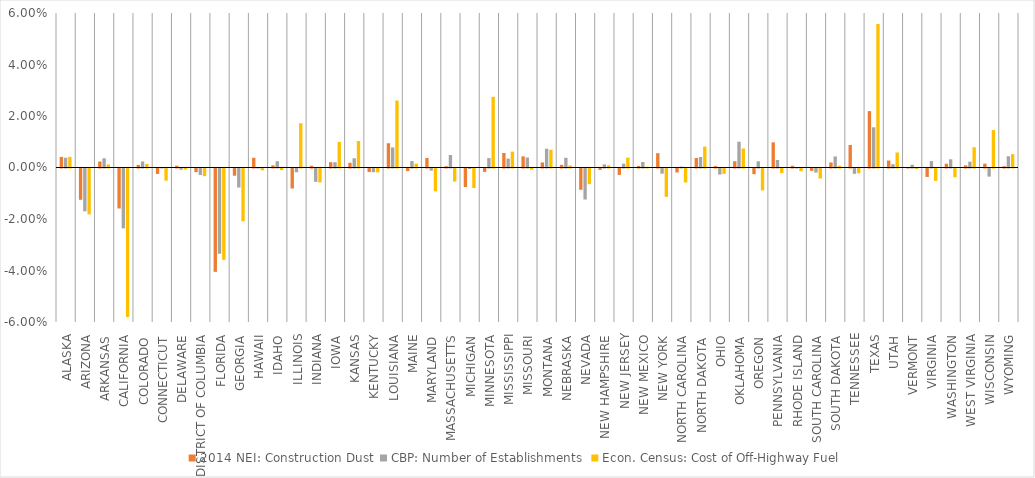
| Category | 2014 NEI: Construction Dust | CBP: Number of Establishments | Econ. Census: Cost of Off-Highway Fuel |
|---|---|---|---|
| ALASKA | 0.004 | 0.004 | 0.004 |
| ARIZONA | -0.012 | -0.017 | -0.018 |
| ARKANSAS | 0.002 | 0.004 | 0.001 |
| CALIFORNIA | -0.016 | -0.023 | -0.058 |
| COLORADO | 0.001 | 0.002 | 0.001 |
| CONNECTICUT | -0.002 | 0 | -0.005 |
| DELAWARE | 0.001 | 0 | 0 |
| DISTRICT OF COLUMBIA | -0.001 | -0.003 | -0.003 |
| FLORIDA | -0.04 | -0.033 | -0.035 |
| GEORGIA | -0.003 | -0.007 | -0.02 |
| HAWAII | 0.004 | 0 | -0.001 |
| IDAHO | 0.001 | 0.002 | -0.001 |
| ILLINOIS | -0.008 | -0.001 | 0.017 |
| INDIANA | 0.001 | -0.005 | -0.005 |
| IOWA | 0.002 | 0.002 | 0.01 |
| KANSAS | 0.002 | 0.004 | 0.01 |
| KENTUCKY | -0.001 | -0.001 | -0.002 |
| LOUISIANA | 0.009 | 0.008 | 0.026 |
| MAINE | -0.001 | 0.003 | 0.001 |
| MARYLAND | 0.004 | -0.001 | -0.009 |
| MASSACHUSETTS | 0 | 0.005 | -0.005 |
| MICHIGAN | -0.007 | 0 | -0.008 |
| MINNESOTA | -0.001 | 0.004 | 0.027 |
| MISSISSIPPI | 0.006 | 0.003 | 0.006 |
| MISSOURI | 0.004 | 0.004 | 0 |
| MONTANA | 0.002 | 0.007 | 0.007 |
| NEBRASKA | 0.001 | 0.004 | 0.001 |
| NEVADA | -0.008 | -0.012 | -0.006 |
| NEW HAMPSHIRE | -0.001 | 0.001 | 0.001 |
| NEW JERSEY | -0.002 | 0.001 | 0.004 |
| NEW MEXICO | 0.001 | 0.002 | 0 |
| NEW YORK | 0.006 | -0.002 | -0.011 |
| NORTH CAROLINA | -0.002 | 0 | -0.005 |
| NORTH DAKOTA | 0.004 | 0.004 | 0.008 |
| OHIO | 0.001 | -0.002 | -0.002 |
| OKLAHOMA | 0.002 | 0.01 | 0.007 |
| OREGON | -0.002 | 0.002 | -0.009 |
| PENNSYLVANIA | 0.01 | 0.003 | -0.002 |
| RHODE ISLAND | 0.001 | 0 | -0.001 |
| SOUTH CAROLINA | -0.001 | -0.002 | -0.004 |
| SOUTH DAKOTA | 0.002 | 0.004 | 0.001 |
| TENNESSEE | 0.009 | -0.002 | -0.002 |
| TEXAS | 0.022 | 0.016 | 0.056 |
| UTAH | 0.003 | 0.001 | 0.006 |
| VERMONT | 0 | 0.001 | 0 |
| VIRGINIA | -0.003 | 0.002 | -0.005 |
| WASHINGTON | 0.001 | 0.003 | -0.003 |
| WEST VIRGINIA | 0.001 | 0.002 | 0.008 |
| WISCONSIN | 0.001 | -0.003 | 0.015 |
| WYOMING | 0.001 | 0.004 | 0.005 |